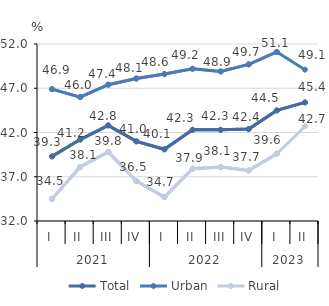
| Category | Total | Urban | Rural |
|---|---|---|---|
| 0 | 39.3 | 46.9 | 34.5 |
| 1 | 41.2 | 46 | 38.1 |
| 2 | 42.8 | 47.4 | 39.8 |
| 3 | 41 | 48.1 | 36.5 |
| 4 | 40.1 | 48.6 | 34.7 |
| 5 | 42.3 | 49.2 | 37.9 |
| 6 | 42.3 | 48.9 | 38.1 |
| 7 | 42.4 | 49.7 | 37.7 |
| 8 | 44.5 | 51.1 | 39.6 |
| 9 | 45.4 | 49.1 | 42.7 |